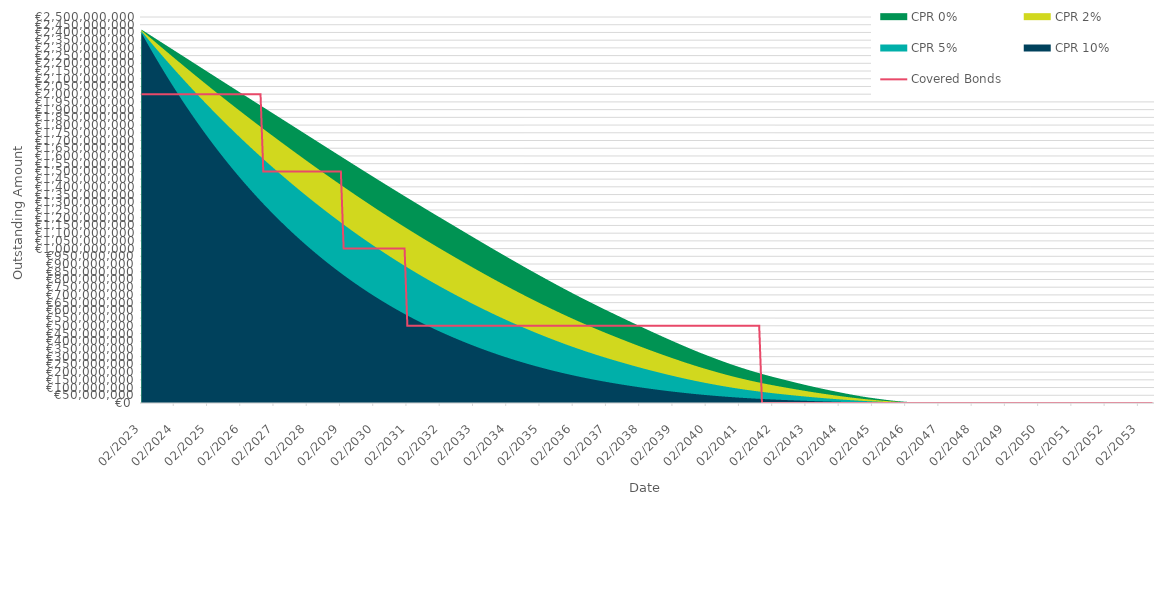
| Category | Covered Bonds |
|---|---|
| 2023-02-28 | 2000000000 |
| 2023-03-31 | 2000000000 |
| 2023-04-30 | 2000000000 |
| 2023-05-31 | 2000000000 |
| 2023-06-30 | 2000000000 |
| 2023-07-31 | 2000000000 |
| 2023-08-31 | 2000000000 |
| 2023-09-30 | 2000000000 |
| 2023-10-31 | 2000000000 |
| 2023-11-30 | 2000000000 |
| 2023-12-31 | 2000000000 |
| 2024-01-31 | 2000000000 |
| 2024-02-29 | 2000000000 |
| 2024-03-31 | 2000000000 |
| 2024-04-30 | 2000000000 |
| 2024-05-31 | 2000000000 |
| 2024-06-30 | 2000000000 |
| 2024-07-31 | 2000000000 |
| 2024-08-31 | 2000000000 |
| 2024-09-30 | 2000000000 |
| 2024-10-31 | 2000000000 |
| 2024-11-30 | 2000000000 |
| 2024-12-31 | 2000000000 |
| 2025-01-31 | 2000000000 |
| 2025-02-28 | 2000000000 |
| 2025-03-31 | 2000000000 |
| 2025-04-30 | 2000000000 |
| 2025-05-31 | 2000000000 |
| 2025-06-30 | 2000000000 |
| 2025-07-31 | 2000000000 |
| 2025-08-31 | 2000000000 |
| 2025-09-30 | 2000000000 |
| 2025-10-31 | 2000000000 |
| 2025-11-30 | 2000000000 |
| 2025-12-31 | 2000000000 |
| 2026-01-31 | 2000000000 |
| 2026-02-28 | 2000000000 |
| 2026-03-31 | 2000000000 |
| 2026-04-30 | 2000000000 |
| 2026-05-31 | 2000000000 |
| 2026-06-30 | 2000000000 |
| 2026-07-31 | 2000000000 |
| 2026-08-31 | 2000000000 |
| 2026-09-30 | 2000000000 |
| 2026-10-31 | 1500000000 |
| 2026-11-30 | 1500000000 |
| 2026-12-31 | 1500000000 |
| 2027-01-31 | 1500000000 |
| 2027-02-28 | 1500000000 |
| 2027-03-31 | 1500000000 |
| 2027-04-30 | 1500000000 |
| 2027-05-31 | 1500000000 |
| 2027-06-30 | 1500000000 |
| 2027-07-31 | 1500000000 |
| 2027-08-31 | 1500000000 |
| 2027-09-30 | 1500000000 |
| 2027-10-31 | 1500000000 |
| 2027-11-30 | 1500000000 |
| 2027-12-31 | 1500000000 |
| 2028-01-31 | 1500000000 |
| 2028-02-29 | 1500000000 |
| 2028-03-31 | 1500000000 |
| 2028-04-30 | 1500000000 |
| 2028-05-31 | 1500000000 |
| 2028-06-30 | 1500000000 |
| 2028-07-31 | 1500000000 |
| 2028-08-31 | 1500000000 |
| 2028-09-30 | 1500000000 |
| 2028-10-31 | 1500000000 |
| 2028-11-30 | 1500000000 |
| 2028-12-31 | 1500000000 |
| 2029-01-31 | 1500000000 |
| 2029-02-28 | 1500000000 |
| 2029-03-31 | 1000000000 |
| 2029-04-30 | 1000000000 |
| 2029-05-31 | 1000000000 |
| 2029-06-30 | 1000000000 |
| 2029-07-31 | 1000000000 |
| 2029-08-31 | 1000000000 |
| 2029-09-30 | 1000000000 |
| 2029-10-31 | 1000000000 |
| 2029-11-30 | 1000000000 |
| 2029-12-31 | 1000000000 |
| 2030-01-31 | 1000000000 |
| 2030-02-28 | 1000000000 |
| 2030-03-31 | 1000000000 |
| 2030-04-30 | 1000000000 |
| 2030-05-31 | 1000000000 |
| 2030-06-30 | 1000000000 |
| 2030-07-31 | 1000000000 |
| 2030-08-31 | 1000000000 |
| 2030-09-30 | 1000000000 |
| 2030-10-31 | 1000000000 |
| 2030-11-30 | 1000000000 |
| 2030-12-31 | 1000000000 |
| 2031-01-31 | 1000000000 |
| 2031-02-28 | 500000000 |
| 2031-03-31 | 500000000 |
| 2031-04-30 | 500000000 |
| 2031-05-31 | 500000000 |
| 2031-06-30 | 500000000 |
| 2031-07-31 | 500000000 |
| 2031-08-31 | 500000000 |
| 2031-09-30 | 500000000 |
| 2031-10-31 | 500000000 |
| 2031-11-30 | 500000000 |
| 2031-12-31 | 500000000 |
| 2032-01-31 | 500000000 |
| 2032-02-29 | 500000000 |
| 2032-03-31 | 500000000 |
| 2032-04-30 | 500000000 |
| 2032-05-31 | 500000000 |
| 2032-06-30 | 500000000 |
| 2032-07-31 | 500000000 |
| 2032-08-31 | 500000000 |
| 2032-09-30 | 500000000 |
| 2032-10-31 | 500000000 |
| 2032-11-30 | 500000000 |
| 2032-12-31 | 500000000 |
| 2033-01-31 | 500000000 |
| 2033-02-28 | 500000000 |
| 2033-03-31 | 500000000 |
| 2033-04-30 | 500000000 |
| 2033-05-31 | 500000000 |
| 2033-06-30 | 500000000 |
| 2033-07-31 | 500000000 |
| 2033-08-31 | 500000000 |
| 2033-09-30 | 500000000 |
| 2033-10-31 | 500000000 |
| 2033-11-30 | 500000000 |
| 2033-12-31 | 500000000 |
| 2034-01-31 | 500000000 |
| 2034-02-28 | 500000000 |
| 2034-03-31 | 500000000 |
| 2034-04-30 | 500000000 |
| 2034-05-31 | 500000000 |
| 2034-06-30 | 500000000 |
| 2034-07-31 | 500000000 |
| 2034-08-31 | 500000000 |
| 2034-09-30 | 500000000 |
| 2034-10-31 | 500000000 |
| 2034-11-30 | 500000000 |
| 2034-12-31 | 500000000 |
| 2035-01-31 | 500000000 |
| 2035-02-28 | 500000000 |
| 2035-03-31 | 500000000 |
| 2035-04-30 | 500000000 |
| 2035-05-31 | 500000000 |
| 2035-06-30 | 500000000 |
| 2035-07-31 | 500000000 |
| 2035-08-31 | 500000000 |
| 2035-09-30 | 500000000 |
| 2035-10-31 | 500000000 |
| 2035-11-30 | 500000000 |
| 2035-12-31 | 500000000 |
| 2036-01-31 | 500000000 |
| 2036-02-29 | 500000000 |
| 2036-03-31 | 500000000 |
| 2036-04-30 | 500000000 |
| 2036-05-31 | 500000000 |
| 2036-06-30 | 500000000 |
| 2036-07-31 | 500000000 |
| 2036-08-31 | 500000000 |
| 2036-09-30 | 500000000 |
| 2036-10-31 | 500000000 |
| 2036-11-30 | 500000000 |
| 2036-12-31 | 500000000 |
| 2037-01-31 | 500000000 |
| 2037-02-28 | 500000000 |
| 2037-03-31 | 500000000 |
| 2037-04-30 | 500000000 |
| 2037-05-31 | 500000000 |
| 2037-06-30 | 500000000 |
| 2037-07-31 | 500000000 |
| 2037-08-31 | 500000000 |
| 2037-09-30 | 500000000 |
| 2037-10-31 | 500000000 |
| 2037-11-30 | 500000000 |
| 2037-12-31 | 500000000 |
| 2038-01-31 | 500000000 |
| 2038-02-28 | 500000000 |
| 2038-03-31 | 500000000 |
| 2038-04-30 | 500000000 |
| 2038-05-31 | 500000000 |
| 2038-06-30 | 500000000 |
| 2038-07-31 | 500000000 |
| 2038-08-31 | 500000000 |
| 2038-09-30 | 500000000 |
| 2038-10-31 | 500000000 |
| 2038-11-30 | 500000000 |
| 2038-12-31 | 500000000 |
| 2039-01-31 | 500000000 |
| 2039-02-28 | 500000000 |
| 2039-03-31 | 500000000 |
| 2039-04-30 | 500000000 |
| 2039-05-31 | 500000000 |
| 2039-06-30 | 500000000 |
| 2039-07-31 | 500000000 |
| 2039-08-31 | 500000000 |
| 2039-09-30 | 500000000 |
| 2039-10-31 | 500000000 |
| 2039-11-30 | 500000000 |
| 2039-12-31 | 500000000 |
| 2040-01-31 | 500000000 |
| 2040-02-29 | 500000000 |
| 2040-03-31 | 500000000 |
| 2040-04-30 | 500000000 |
| 2040-05-31 | 500000000 |
| 2040-06-30 | 500000000 |
| 2040-07-31 | 500000000 |
| 2040-08-31 | 500000000 |
| 2040-09-30 | 500000000 |
| 2040-10-31 | 500000000 |
| 2040-11-30 | 500000000 |
| 2040-12-31 | 500000000 |
| 2041-01-31 | 500000000 |
| 2041-02-28 | 500000000 |
| 2041-03-31 | 500000000 |
| 2041-04-30 | 500000000 |
| 2041-05-31 | 500000000 |
| 2041-06-30 | 500000000 |
| 2041-07-31 | 500000000 |
| 2041-08-31 | 500000000 |
| 2041-09-30 | 500000000 |
| 2041-10-31 | 0 |
| 2041-11-30 | 0 |
| 2041-12-31 | 0 |
| 2042-01-31 | 0 |
| 2042-02-28 | 0 |
| 2042-03-31 | 0 |
| 2042-04-30 | 0 |
| 2042-05-31 | 0 |
| 2042-06-30 | 0 |
| 2042-07-31 | 0 |
| 2042-08-31 | 0 |
| 2042-09-30 | 0 |
| 2042-10-31 | 0 |
| 2042-11-30 | 0 |
| 2042-12-31 | 0 |
| 2043-01-31 | 0 |
| 2043-02-28 | 0 |
| 2043-03-31 | 0 |
| 2043-04-30 | 0 |
| 2043-05-31 | 0 |
| 2043-06-30 | 0 |
| 2043-07-31 | 0 |
| 2043-08-31 | 0 |
| 2043-09-30 | 0 |
| 2043-10-31 | 0 |
| 2043-11-30 | 0 |
| 2043-12-31 | 0 |
| 2044-01-31 | 0 |
| 2044-02-29 | 0 |
| 2044-03-31 | 0 |
| 2044-04-30 | 0 |
| 2044-05-31 | 0 |
| 2044-06-30 | 0 |
| 2044-07-31 | 0 |
| 2044-08-31 | 0 |
| 2044-09-30 | 0 |
| 2044-10-31 | 0 |
| 2044-11-30 | 0 |
| 2044-12-31 | 0 |
| 2045-01-31 | 0 |
| 2045-02-28 | 0 |
| 2045-03-31 | 0 |
| 2045-04-30 | 0 |
| 2045-05-31 | 0 |
| 2045-06-30 | 0 |
| 2045-07-31 | 0 |
| 2045-08-31 | 0 |
| 2045-09-30 | 0 |
| 2045-10-31 | 0 |
| 2045-11-30 | 0 |
| 2045-12-31 | 0 |
| 2046-01-31 | 0 |
| 2046-02-28 | 0 |
| 2046-03-31 | 0 |
| 2046-04-30 | 0 |
| 2046-05-31 | 0 |
| 2046-06-30 | 0 |
| 2046-07-31 | 0 |
| 2046-08-31 | 0 |
| 2046-09-30 | 0 |
| 2046-10-31 | 0 |
| 2046-11-30 | 0 |
| 2046-12-31 | 0 |
| 2047-01-31 | 0 |
| 2047-02-28 | 0 |
| 2047-03-31 | 0 |
| 2047-04-30 | 0 |
| 2047-05-31 | 0 |
| 2047-06-30 | 0 |
| 2047-07-31 | 0 |
| 2047-08-31 | 0 |
| 2047-09-30 | 0 |
| 2047-10-31 | 0 |
| 2047-11-30 | 0 |
| 2047-12-31 | 0 |
| 2048-01-31 | 0 |
| 2048-02-29 | 0 |
| 2048-03-31 | 0 |
| 2048-04-30 | 0 |
| 2048-05-31 | 0 |
| 2048-06-30 | 0 |
| 2048-07-31 | 0 |
| 2048-08-31 | 0 |
| 2048-09-30 | 0 |
| 2048-10-31 | 0 |
| 2048-11-30 | 0 |
| 2048-12-31 | 0 |
| 2049-01-31 | 0 |
| 2049-02-28 | 0 |
| 2049-03-31 | 0 |
| 2049-04-30 | 0 |
| 2049-05-31 | 0 |
| 2049-06-30 | 0 |
| 2049-07-31 | 0 |
| 2049-08-31 | 0 |
| 2049-09-30 | 0 |
| 2049-10-31 | 0 |
| 2049-11-30 | 0 |
| 2049-12-31 | 0 |
| 2050-01-31 | 0 |
| 2050-02-28 | 0 |
| 2050-03-31 | 0 |
| 2050-04-30 | 0 |
| 2050-05-31 | 0 |
| 2050-06-30 | 0 |
| 2050-07-31 | 0 |
| 2050-08-31 | 0 |
| 2050-09-30 | 0 |
| 2050-10-31 | 0 |
| 2050-11-30 | 0 |
| 2050-12-31 | 0 |
| 2051-01-31 | 0 |
| 2051-02-28 | 0 |
| 2051-03-31 | 0 |
| 2051-04-30 | 0 |
| 2051-05-31 | 0 |
| 2051-06-30 | 0 |
| 2051-07-31 | 0 |
| 2051-08-31 | 0 |
| 2051-09-30 | 0 |
| 2051-10-31 | 0 |
| 2051-11-30 | 0 |
| 2051-12-31 | 0 |
| 2052-01-31 | 0 |
| 2052-02-29 | 0 |
| 2052-03-31 | 0 |
| 2052-04-30 | 0 |
| 2052-05-31 | 0 |
| 2052-06-30 | 0 |
| 2052-07-31 | 0 |
| 2052-08-31 | 0 |
| 2052-09-30 | 0 |
| 2052-10-31 | 0 |
| 2052-11-30 | 0 |
| 2052-12-31 | 0 |
| 2053-01-31 | 0 |
| 2053-02-28 | 0 |
| 2053-03-31 | 0 |
| 2053-04-30 | 0 |
| 2053-05-31 | 0 |
| 2053-06-30 | 0 |
| 2053-07-31 | 0 |